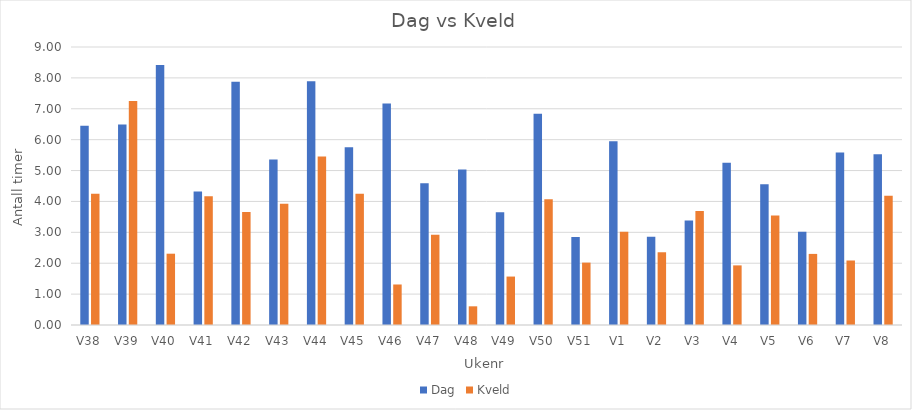
| Category | Dag | Kveld |
|---|---|---|
| V38 | 6.447 | 4.247 |
| V39 | 6.488 | 7.25 |
| V40 | 8.417 | 2.308 |
| V41 | 4.323 | 4.17 |
| V42 | 7.872 | 3.657 |
| V43 | 5.36 | 3.925 |
| V44 | 7.888 | 5.455 |
| V45 | 5.758 | 4.247 |
| V46 | 7.173 | 1.312 |
| V47 | 4.587 | 2.923 |
| V48 | 5.033 | 0.605 |
| V49 | 3.65 | 1.568 |
| V50 | 6.84 | 4.07 |
| V51 | 2.85 | 2.02 |
| V1 | 5.952 | 3.022 |
| V2 | 2.857 | 2.355 |
| V3 | 3.385 | 3.692 |
| V4 | 5.255 | 1.93 |
| V5 | 4.555 | 3.548 |
| V6 | 3.018 | 2.302 |
| V7 | 5.582 | 2.088 |
| V8 | 5.53 | 4.188 |